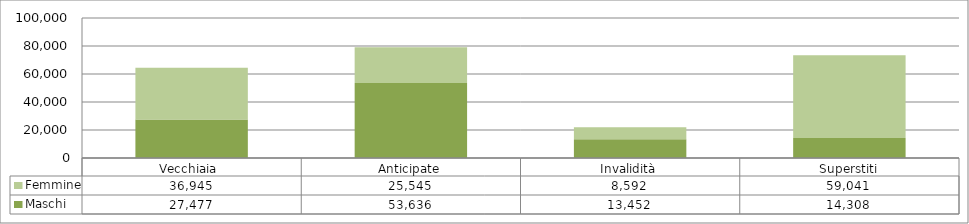
| Category | Maschi | Femmine |
|---|---|---|
| Vecchiaia  | 27477 | 36945 |
| Anticipate | 53636 | 25545 |
| Invalidità | 13452 | 8592 |
| Superstiti | 14308 | 59041 |